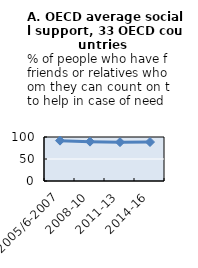
| Category | Social support (OECD 33) |
|---|---|
| 2005/6-2007 | 91.711 |
| 2008-10 | 89.435 |
| 2011-13 | 88.267 |
| 2014-16 | 88.569 |